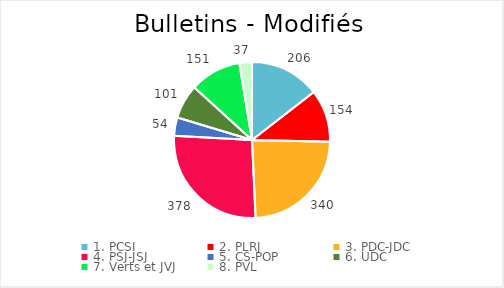
| Category | Series 0 |
|---|---|
| 1. PCSI | 206 |
| 2. PLRJ | 154 |
| 3. PDC-JDC | 340 |
| 4. PSJ-JSJ | 378 |
| 5. CS-POP | 54 |
| 6. UDC | 101 |
| 7. Verts et JVJ | 151 |
| 8. PVL | 37 |